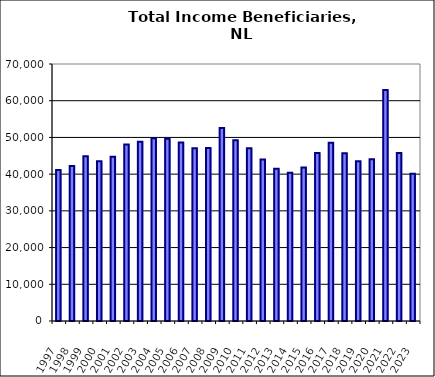
| Category | Series 0 |
|---|---|
| 1997.0 | 41125.833 |
| 1998.0 | 42208.333 |
| 1999.0 | 44847.5 |
| 2000.0 | 43480 |
| 2001.0 | 44735.833 |
| 2002.0 | 48106.667 |
| 2003.0 | 48823.333 |
| 2004.0 | 49810 |
| 2005.0 | 49634.167 |
| 2006.0 | 48585 |
| 2007.0 | 47044.167 |
| 2008.0 | 47100.833 |
| 2009.0 | 52555.833 |
| 2010.0 | 49254.167 |
| 2011.0 | 47025.833 |
| 2012.0 | 43958.333 |
| 2013.0 | 41489.167 |
| 2014.0 | 40348.333 |
| 2015.0 | 41814.167 |
| 2016.0 | 45732.5 |
| 2017.0 | 48570.833 |
| 2018.0 | 45675 |
| 2019.0 | 43500 |
| 2020.0 | 44037.5 |
| 2021.0 | 62909.167 |
| 2022.0 | 45768.333 |
| 2023.0 | 40098.333 |